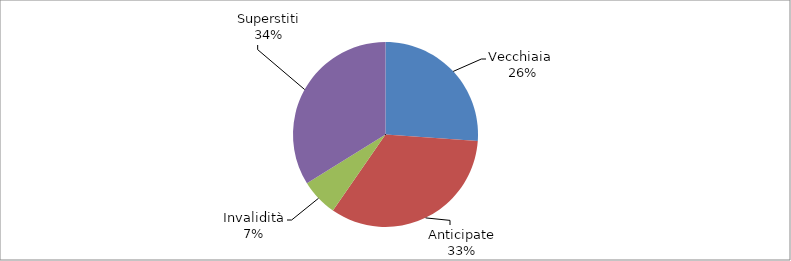
| Category | Series 0 |
|---|---|
| Vecchiaia  | 6452 |
| Anticipate | 8277 |
| Invalidità | 1613 |
| Superstiti | 8361 |